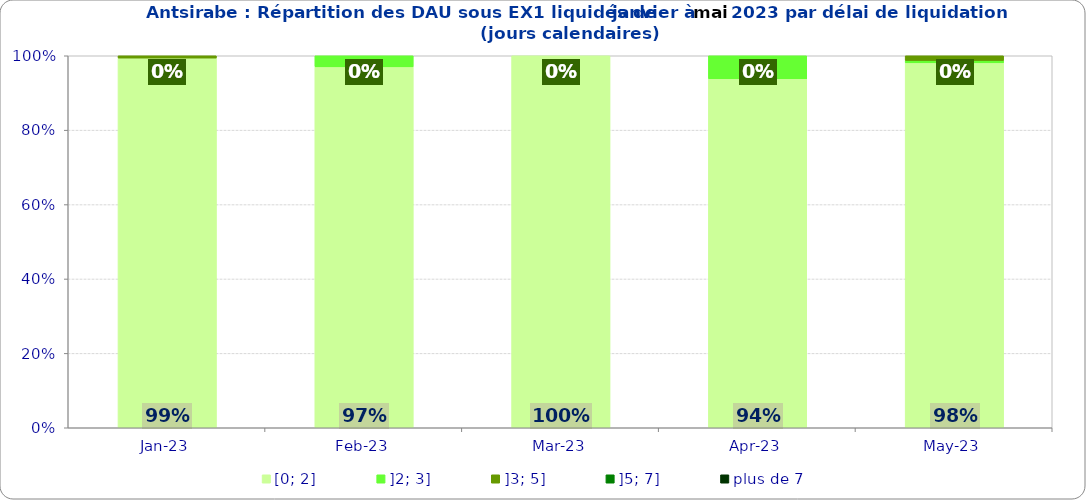
| Category | [0; 2] | ]2; 3] | ]3; 5] | ]5; 7] | plus de 7 |
|---|---|---|---|---|---|
| 2023-01-01 | 0.994 | 0 | 0.006 | 0 | 0 |
| 2023-02-01 | 0.97 | 0.03 | 0 | 0 | 0 |
| 2023-03-01 | 1 | 0 | 0 | 0 | 0 |
| 2023-04-01 | 0.938 | 0.062 | 0 | 0 | 0 |
| 2023-05-01 | 0.981 | 0.006 | 0.013 | 0 | 0 |